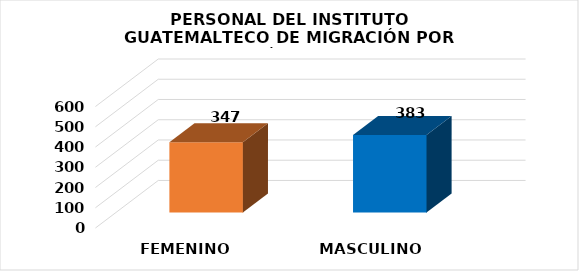
| Category | Series 0 |
|---|---|
| FEMENINO | 347 |
| MASCULINO | 383 |